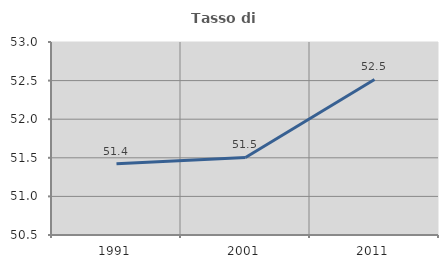
| Category | Tasso di occupazione   |
|---|---|
| 1991.0 | 51.424 |
| 2001.0 | 51.504 |
| 2011.0 | 52.515 |